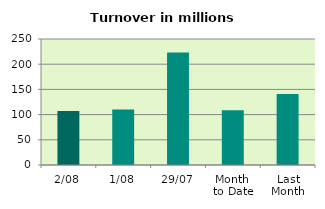
| Category | Series 0 |
|---|---|
| 2/08 | 107.352 |
| 1/08 | 110.25 |
| 29/07 | 223.186 |
| Month 
to Date | 108.801 |
| Last
Month | 140.832 |